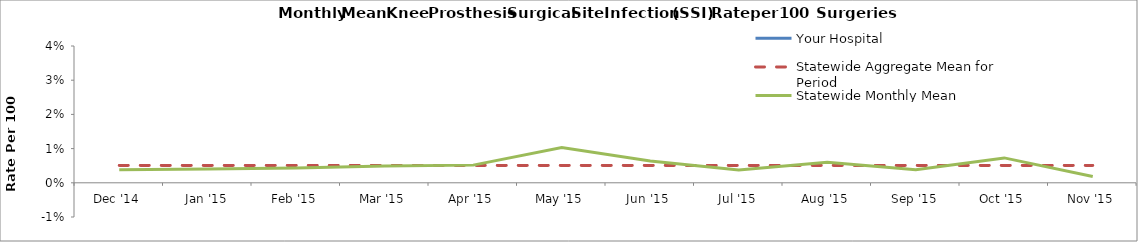
| Category | Your Hospital | Statewide Aggregate Mean for Period | Statewide Monthly Mean |
|---|---|---|---|
| Dec '14 |  | 0.005 | 0.004 |
| Jan '15 |  | 0.005 | 0.004 |
| Feb '15 |  | 0.005 | 0.004 |
| Mar '15 |  | 0.005 | 0.005 |
| Apr '15 |  | 0.005 | 0.005 |
| May '15 |  | 0.005 | 0.01 |
| Jun '15 |  | 0.005 | 0.006 |
| Jul '15 |  | 0.005 | 0.004 |
| Aug '15 |  | 0.005 | 0.006 |
| Sep '15 |  | 0.005 | 0.004 |
| Oct '15 |  | 0.005 | 0.007 |
| Nov '15 |  | 0.005 | 0.002 |